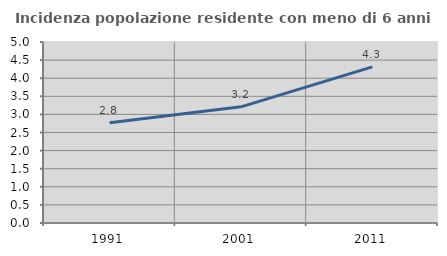
| Category | Incidenza popolazione residente con meno di 6 anni |
|---|---|
| 1991.0 | 2.767 |
| 2001.0 | 3.209 |
| 2011.0 | 4.314 |